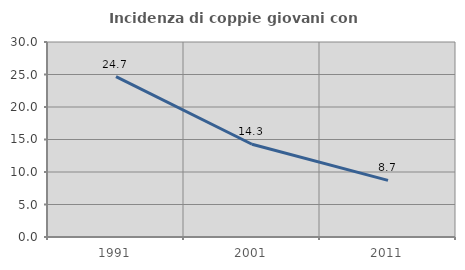
| Category | Incidenza di coppie giovani con figli |
|---|---|
| 1991.0 | 24.66 |
| 2001.0 | 14.272 |
| 2011.0 | 8.717 |